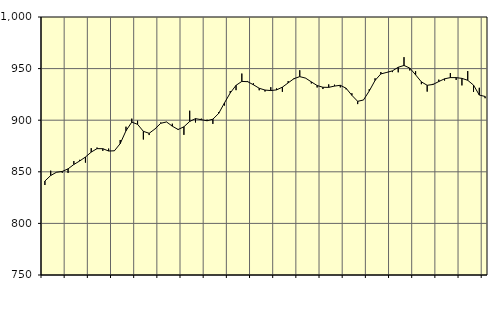
| Category | Piggar | Series 1 |
|---|---|---|
| nan | 837.2 | 841.06 |
| 1.0 | 851.1 | 846.41 |
| 1.0 | 849.7 | 849.55 |
| 1.0 | 849.1 | 850.34 |
| nan | 848.9 | 852.86 |
| 2.0 | 860.4 | 857.1 |
| 2.0 | 861.6 | 860.46 |
| 2.0 | 858.9 | 864.3 |
| nan | 872.9 | 869.09 |
| 3.0 | 873.5 | 872.45 |
| 3.0 | 870.3 | 872.39 |
| 3.0 | 872.5 | 870.13 |
| nan | 870.6 | 870.34 |
| 4.0 | 880.8 | 877.29 |
| 4.0 | 893.7 | 889.75 |
| 4.0 | 901.5 | 898.12 |
| nan | 899.5 | 896 |
| 5.0 | 881.3 | 889.21 |
| 5.0 | 885.6 | 887.3 |
| 5.0 | 891.4 | 891.49 |
| nan | 897.8 | 897 |
| 6.0 | 898.4 | 898.31 |
| 6.0 | 896.6 | 894.19 |
| 6.0 | 890.5 | 890.98 |
| nan | 885.8 | 893.61 |
| 7.0 | 909.2 | 898.78 |
| 7.0 | 897.8 | 901.5 |
| 7.0 | 901.5 | 900.51 |
| nan | 900.5 | 899.45 |
| 8.0 | 896.4 | 900.97 |
| 8.0 | 907.9 | 906.56 |
| 8.0 | 914.2 | 916.73 |
| nan | 928.3 | 926.4 |
| 9.0 | 929.1 | 933.8 |
| 9.0 | 945.2 | 937.59 |
| 9.0 | 938 | 937.34 |
| nan | 935.8 | 934.34 |
| 10.0 | 929 | 930.95 |
| 10.0 | 927.8 | 929.19 |
| 10.0 | 932 | 928.72 |
| nan | 930.8 | 929.38 |
| 11.0 | 927.5 | 932.01 |
| 11.0 | 937.9 | 936.18 |
| 11.0 | 939.8 | 940.27 |
| nan | 948.4 | 942.21 |
| 12.0 | 940.9 | 940.8 |
| 12.0 | 935.6 | 937.13 |
| 12.0 | 931.7 | 933.6 |
| nan | 930.2 | 931.9 |
| 13.0 | 934.7 | 931.81 |
| 13.0 | 934.4 | 933.06 |
| 13.0 | 931.8 | 933.83 |
| nan | 929.9 | 930.97 |
| 14.0 | 926.1 | 924.11 |
| 14.0 | 915.6 | 918.28 |
| 14.0 | 919.5 | 919.58 |
| nan | 930 | 928.3 |
| 15.0 | 940.6 | 938.54 |
| 15.0 | 946.7 | 944.83 |
| 15.0 | 945.9 | 946.29 |
| nan | 946.6 | 947.81 |
| 16.0 | 946.4 | 951.29 |
| 16.0 | 961.1 | 953.05 |
| 16.0 | 948.2 | 950.47 |
| nan | 947.5 | 943.96 |
| 17.0 | 934.9 | 937.15 |
| 17.0 | 927.7 | 933.83 |
| 17.0 | 935.2 | 934.62 |
| nan | 939.3 | 937.45 |
| 18.0 | 938.4 | 940.09 |
| 18.0 | 945.7 | 941.27 |
| 18.0 | 939 | 941.25 |
| nan | 933.7 | 940.52 |
| 19.0 | 947.6 | 938.68 |
| 19.0 | 927.4 | 934.01 |
| 19.0 | 931.4 | 924.35 |
| nan | 921.3 | 923.01 |